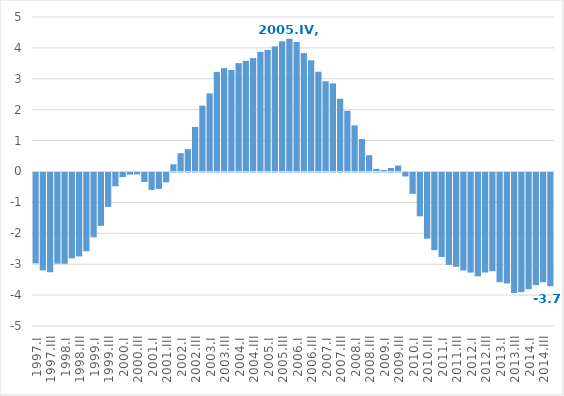
| Category | Excesso das exportações sobre as importações |
|---|---|
| 1997.I | -2.941 |
| 1997.II | -3.167 |
| 1997.III | -3.228 |
| 1997.IV | -2.951 |
| 1998.I | -2.952 |
| 1998.II | -2.778 |
| 1998.III | -2.717 |
| 1998.IV | -2.55 |
| 1999.I | -2.098 |
| 1999.II | -1.726 |
| 1999.III | -1.112 |
| 1999.IV | -0.45 |
| 2000.I | -0.15 |
| 2000.II | -0.069 |
| 2000.III | -0.059 |
| 2000.IV | -0.306 |
| 2001.I | -0.561 |
| 2001.II | -0.531 |
| 2001.III | -0.318 |
| 2001.IV | 0.233 |
| 2002.I | 0.593 |
| 2002.II | 0.722 |
| 2002.III | 1.445 |
| 2002.IV | 2.133 |
| 2003.I | 2.527 |
| 2003.II | 3.222 |
| 2003.III | 3.345 |
| 2003.IV | 3.285 |
| 2004.I | 3.508 |
| 2004.II | 3.581 |
| 2004.III | 3.67 |
| 2004.IV | 3.872 |
| 2005.I | 3.931 |
| 2005.II | 4.049 |
| 2005.III | 4.213 |
| 2005.IV | 4.294 |
| 2006.I | 4.195 |
| 2006.II | 3.833 |
| 2006.III | 3.596 |
| 2006.IV | 3.228 |
| 2007.I | 2.92 |
| 2007.II | 2.853 |
| 2007.III | 2.354 |
| 2007.IV | 1.964 |
| 2008.I | 1.493 |
| 2008.II | 1.053 |
| 2008.III | 0.527 |
| 2008.IV | 0.087 |
| 2009.I | 0.051 |
| 2009.II | 0.114 |
| 2009.III | 0.193 |
| 2009.IV | -0.129 |
| 2010.I | -0.691 |
| 2010.II | -1.419 |
| 2010.III | -2.142 |
| 2010.IV | -2.511 |
| 2011.I | -2.736 |
| 2011.II | -2.99 |
| 2011.III | -3.05 |
| 2011.IV | -3.17 |
| 2012.I | -3.24 |
| 2012.II | -3.359 |
| 2012.III | -3.237 |
| 2012.IV | -3.196 |
| 2013.I | -3.55 |
| 2013.II | -3.592 |
| 2013.III | -3.901 |
| 2013.IV | -3.87 |
| 2014.I | -3.776 |
| 2014.II | -3.645 |
| 2014.III | -3.552 |
| 2014.IV | -3.681 |